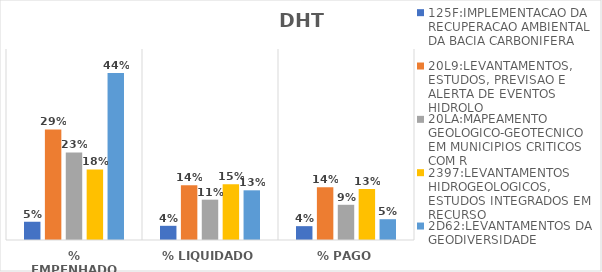
| Category | 125F:IMPLEMENTACAO DA RECUPERACAO AMBIENTAL DA BACIA CARBONIFERA | 20L9:LEVANTAMENTOS, ESTUDOS, PREVISAO E ALERTA DE EVENTOS HIDROLO | 20LA:MAPEAMENTO GEOLOGICO-GEOTECNICO EM MUNICIPIOS CRITICOS COM R | 2397:LEVANTAMENTOS HIDROGEOLOGICOS, ESTUDOS INTEGRADOS EM RECURSO | 2D62:LEVANTAMENTOS DA GEODIVERSIDADE |
|---|---|---|---|---|---|
| % EMPENHADO | 0.048 | 0.29 | 0.229 | 0.185 | 0.437 |
| % LIQUIDADO | 0.037 | 0.143 | 0.106 | 0.146 | 0.13 |
| % PAGO | 0.036 | 0.138 | 0.092 | 0.134 | 0.054 |